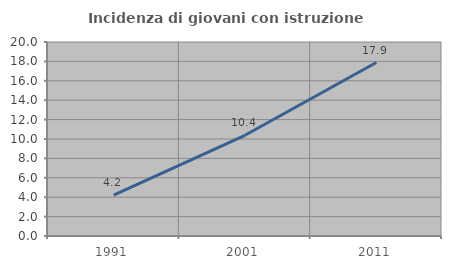
| Category | Incidenza di giovani con istruzione universitaria |
|---|---|
| 1991.0 | 4.206 |
| 2001.0 | 10.381 |
| 2011.0 | 17.884 |